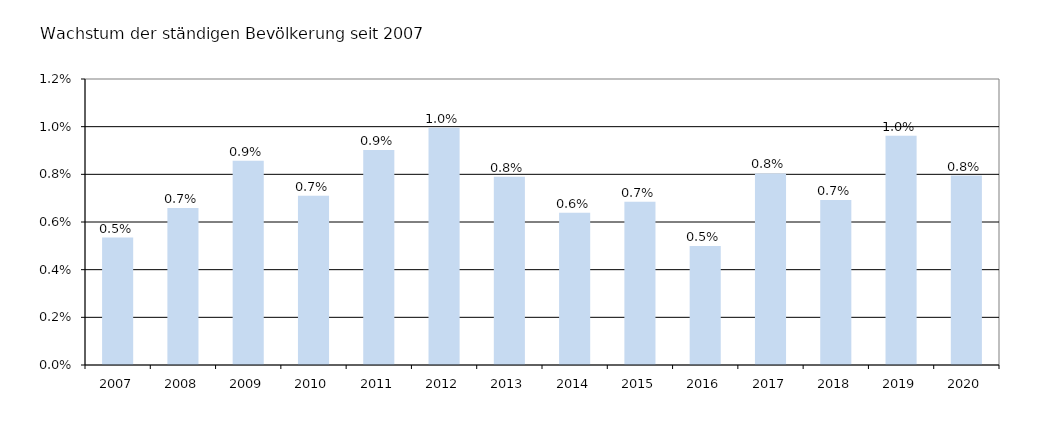
| Category | Series 2 |
|---|---|
| 2007.0 | 0.005 |
| 2008.0 | 0.007 |
| 2009.0 | 0.009 |
| 2010.0 | 0.007 |
| 2011.0 | 0.009 |
| 2012.0 | 0.01 |
| 2013.0 | 0.008 |
| 2014.0 | 0.006 |
| 2015.0 | 0.007 |
| 2016.0 | 0.005 |
| 2017.0 | 0.008 |
| 2018.0 | 0.007 |
| 2019.0 | 0.01 |
| 2020.0 | 0.008 |